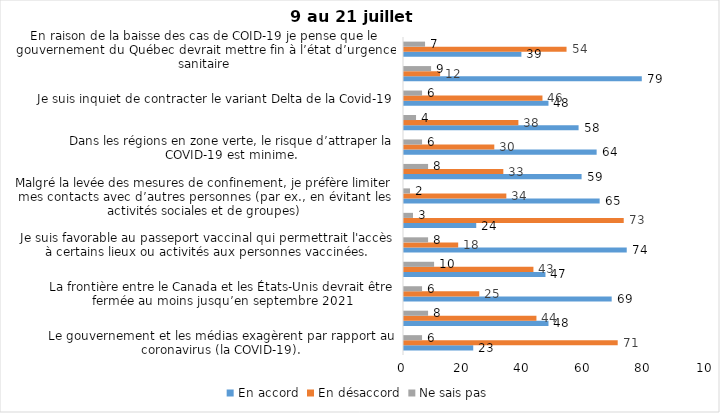
| Category | En accord | En désaccord | Ne sais pas |
|---|---|---|---|
| Le gouvernement et les médias exagèrent par rapport au coronavirus (la COVID-19). | 23 | 71 | 6 |
| J’ai peur que le système de santé soit débordé par les cas de COVID-19 suite au "déconfinement" | 48 | 44 | 8 |
| La frontière entre le Canada et les États-Unis devrait être fermée au moins jusqu’en septembre 2021 | 69 | 25 | 6 |
| Les personnes vaccinées contre la COVID-19 devraient avoir le droit de faire des rassemblements privés et de ne plus porter le masque dans les lieux publics. | 47 | 43 | 10 |
| Je suis favorable au passeport vaccinal qui permettrait l'accès à certains lieux ou activités aux personnes vaccinées. | 74 | 18 | 8 |
| Étant donné la progression de la vaccination et la diminution du nombre de cas de COVID-19, je pense qu’il est moins important de suivre les mesures de prévention. | 24 | 73 | 3 |
| Malgré la levée des mesures de confinement, je préfère limiter mes contacts avec d’autres personnes (par ex., en évitant les activités sociales et de groupes) | 65 | 34 | 2 |
| J’ai peur qu’il y ait une 4e vague de la COVID-19. | 59 | 33 | 8 |
| Dans les régions en zone verte, le risque d’attraper la COVID-19 est minime. | 64 | 30 | 6 |
| Si les cas de COVID-19 augmentent cet automne, je suis favorable à la mise en place de mesures de confinement (ex. fermeture de services non essentiels, interdiction des rassemblements privés) | 58 | 38 | 4 |
| Je suis inquiet de contracter le variant Delta de la Covid-19 | 48 | 46 | 6 |
| Je suis confiant que la vaccination protège efficacement contre les variants de la COVID-19 | 79 | 12 | 9 |
| En raison de la baisse des cas de COID-19 je pense que le gouvernement du Québec devrait mettre fin à l’état d’urgence sanitaire | 39 | 54 | 7 |